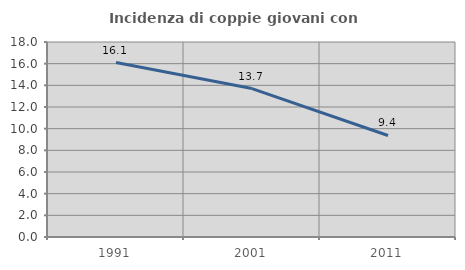
| Category | Incidenza di coppie giovani con figli |
|---|---|
| 1991.0 | 16.1 |
| 2001.0 | 13.701 |
| 2011.0 | 9.37 |